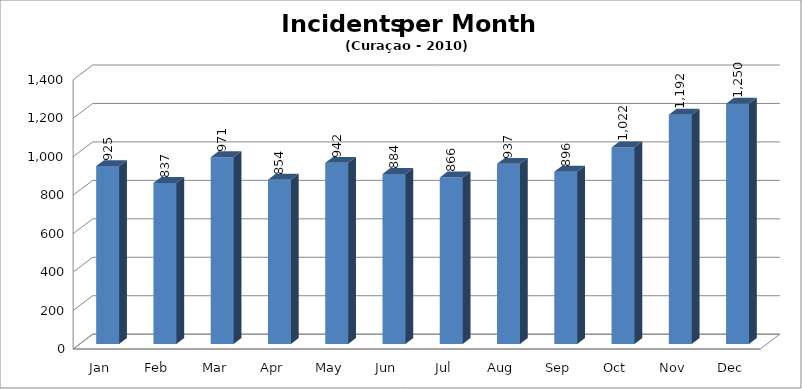
| Category | Series 0 |
|---|---|
| Jan | 925 |
| Feb | 837 |
| Mar | 971 |
| Apr | 854 |
| May | 942 |
| Jun | 884 |
| Jul | 866 |
| Aug | 937 |
| Sep | 896 |
| Oct | 1022 |
| Nov | 1192 |
| Dec | 1250 |